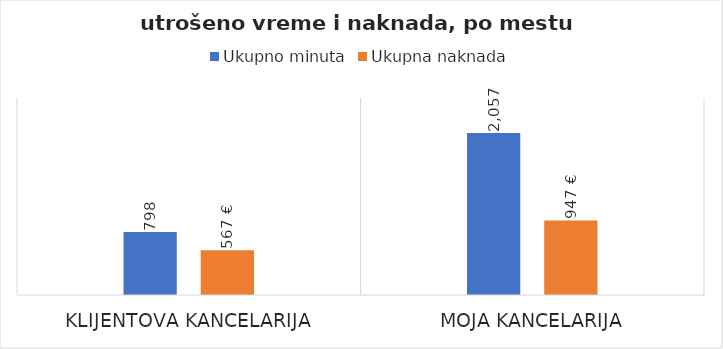
| Category | Ukupno minuta | Ukupna naknada |
|---|---|---|
| Klijentova kancelarija | 798 | 567 |
| Moja kancelarija | 2057 | 947 |